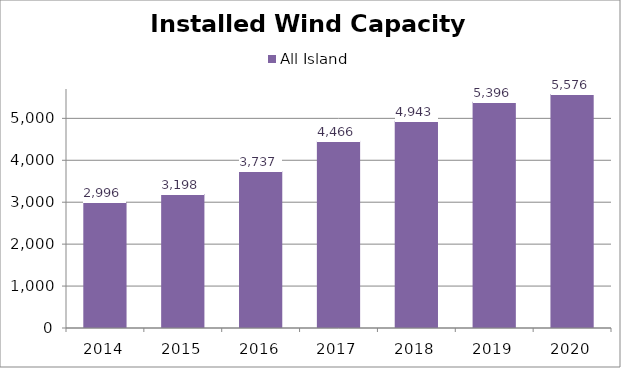
| Category | All Island |
|---|---|
| 2014.0 | 2995.552 |
| 2015.0 | 3198.292 |
| 2016.0 | 3737.379 |
| 2017.0 | 4465.982 |
| 2018.0 | 4943.292 |
| 2019.0 | 5395.897 |
| 2020.0 | 5576.095 |